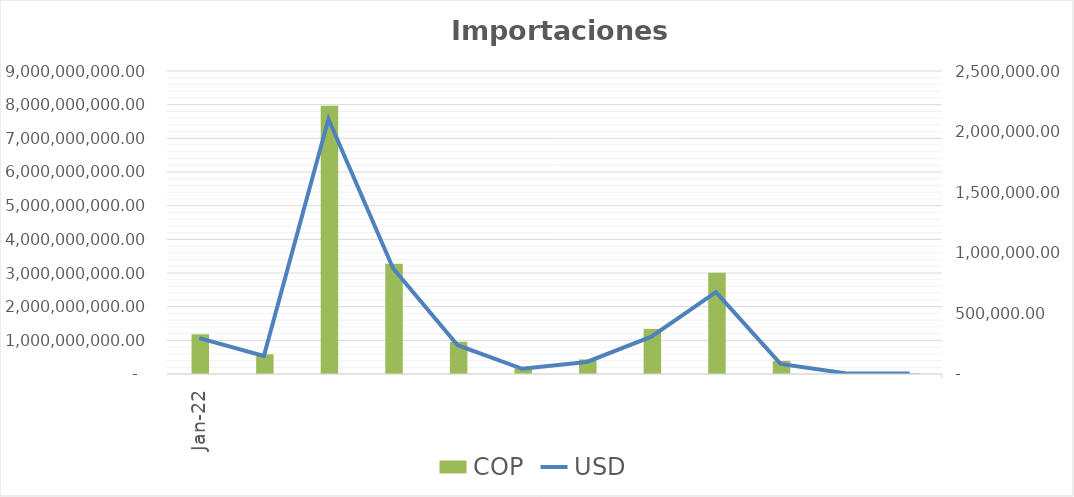
| Category | COP |
|---|---|
| 2020-01-01 | 24219077275 |
| 2020-02-01 | 32309062906 |
| 2020-03-01 | 15964138997 |
| 2020-04-01 | 24099265138 |
| 2020-05-01 | 43682182345 |
| 2020-06-01 | 37458396599 |
| 2020-07-01 | 24099265138 |
| 2020-08-01 | 43682182345 |
| 2020-09-01 | 37458396599 |
| 2020-10-01 | 256286139 |
| 2020-11-01 | 80570438 |
| 2020-12-01 | 865782780 |
| 2021-01-01 | 391018233 |
| 2021-02-01 | 1333328188 |
| 2021-03-01 | 12956156483 |
| 2021-04-01 | 10291158014 |
| 2021-05-01 | 792640574 |
| 2021-06-01 | 168822680 |
| 2021-07-01 | 112006888 |
| 2021-08-01 | 59285004 |
| 2021-09-01 | 14687506 |
| 2021-10-01 | 458514190 |
| 2021-11-01 | 117517938 |
| 2021-12-01 | 29959064602 |
| 2022-01-01 | 1179868203 |
| 2022-02-01 | 584903476 |
| 2022-03-01 | 7970496462 |
| 2022-04-01 | 3273436258 |
| 2022-05-01 | 958953044 |
| 2022-06-01 | 166838202 |
| 2022-07-01 | 434140359 |
| 2022-08-01 | 1340410237 |
| 2022-09-01 | 3007504634 |
| 2022-10-01 | 390030004 |
| 2022-11-01 | 29921516 |
| 2022-12-01 | 19806960 |